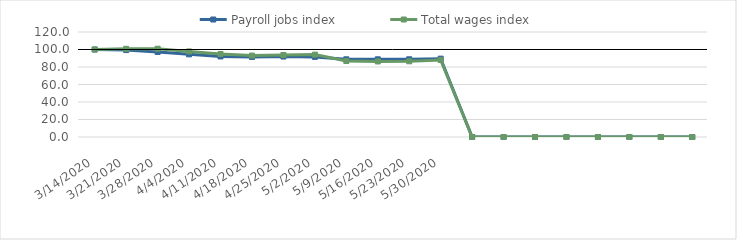
| Category | Payroll jobs index | Total wages index |
|---|---|---|
| 14/03/2020 | 100 | 100 |
| 21/03/2020 | 99.357 | 100.808 |
| 28/03/2020 | 97.181 | 100.871 |
| 04/04/2020 | 94.459 | 97.799 |
| 11/04/2020 | 92.036 | 94.91 |
| 18/04/2020 | 91.466 | 93.046 |
| 25/04/2020 | 91.963 | 93.697 |
| 02/05/2020 | 91.533 | 94.146 |
| 09/05/2020 | 88.786 | 86.809 |
| 16/05/2020 | 88.804 | 86.325 |
| 23/05/2020 | 88.832 | 86.517 |
| 30/05/2020 | 89.543 | 88.008 |